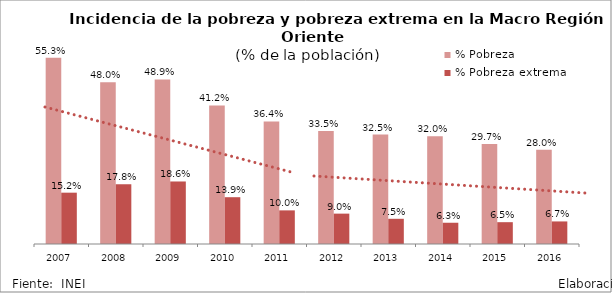
| Category | % Pobreza | % Pobreza extrema |
|---|---|---|
| 2007.0 | 0.553 | 0.152 |
| 2008.0 | 0.48 | 0.178 |
| 2009.0 | 0.489 | 0.186 |
| 2010.0 | 0.412 | 0.139 |
| 2011.0 | 0.364 | 0.1 |
| 2012.0 | 0.335 | 0.09 |
| 2013.0 | 0.325 | 0.075 |
| 2014.0 | 0.32 | 0.063 |
| 2015.0 | 0.297 | 0.065 |
| 2016.0 | 0.28 | 0.067 |